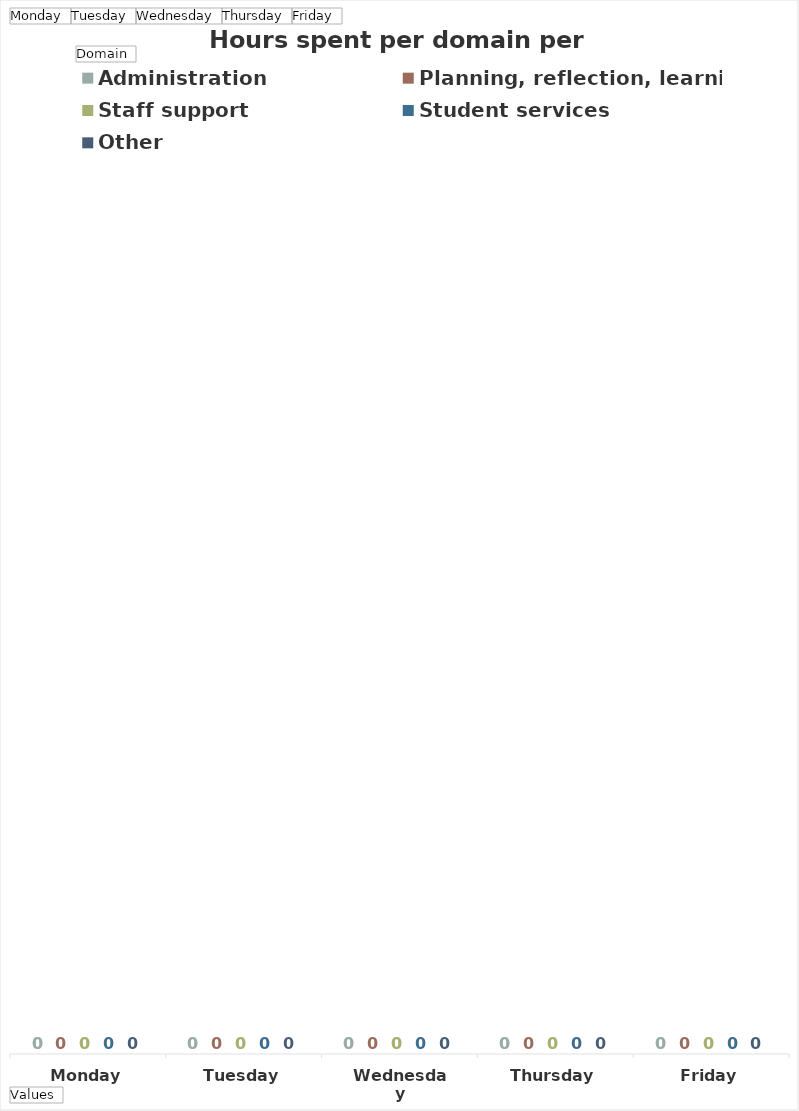
| Category | Administration | Planning, reflection, learning | Staff support | Student services | Other |
|---|---|---|---|---|---|
| Monday | 0 | 0 | 0 | 0 | 0 |
| Tuesday | 0 | 0 | 0 | 0 | 0 |
| Wednesday | 0 | 0 | 0 | 0 | 0 |
| Thursday | 0 | 0 | 0 | 0 | 0 |
| Friday | 0 | 0 | 0 | 0 | 0 |